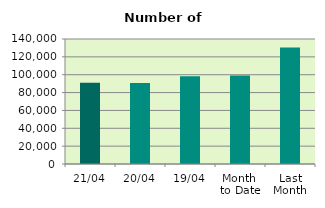
| Category | Series 0 |
|---|---|
| 21/04 | 91096 |
| 20/04 | 90752 |
| 19/04 | 98282 |
| Month 
to Date | 99181.231 |
| Last
Month | 130565.565 |